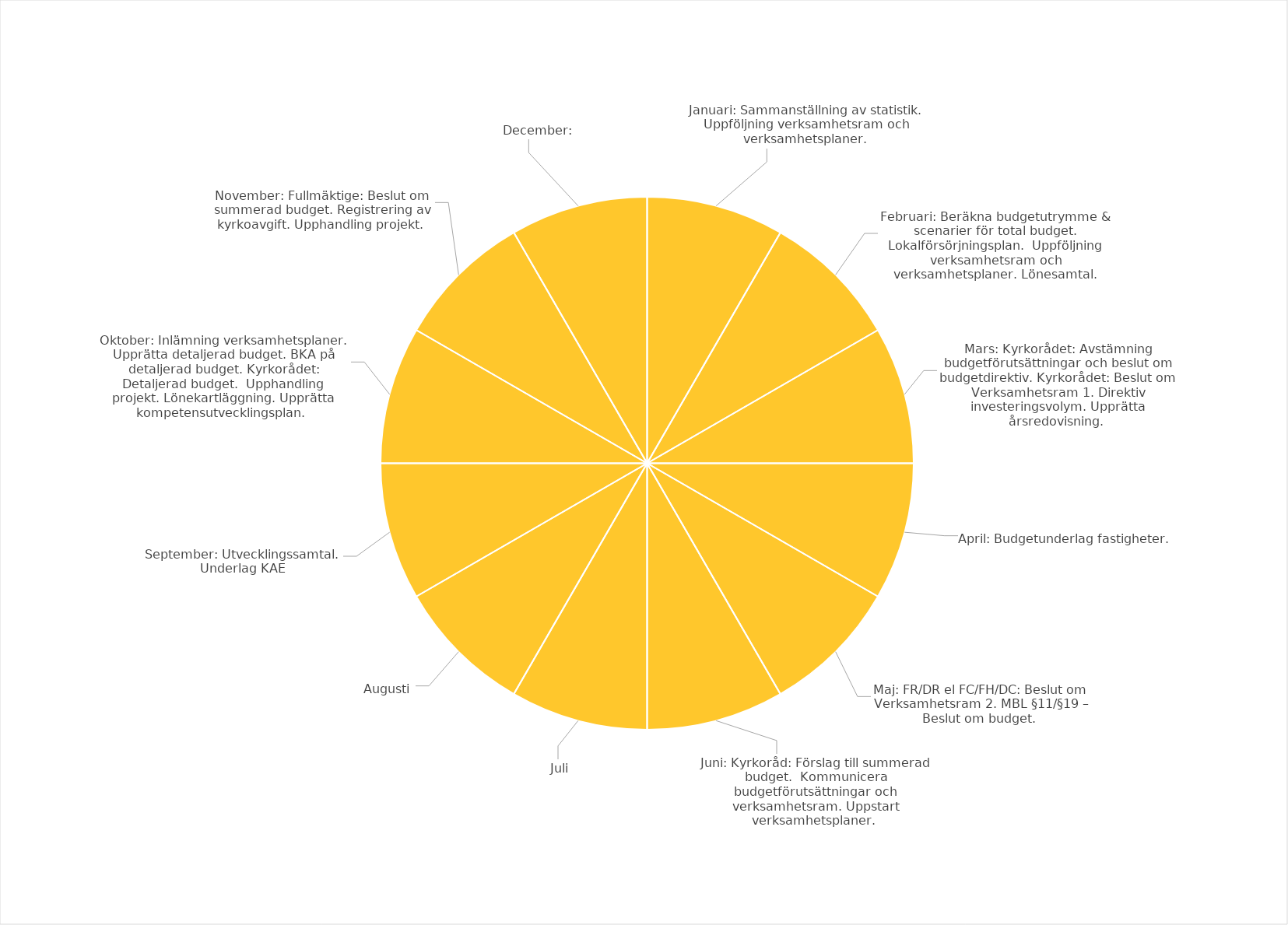
| Category | Series 0 |
|---|---|
| Januari: Sammanställning av statistik. Uppföljning verksamhetsram och verksamhetsplaner.  | 1 |
| Februari: Beräkna budgetutrymme & scenarier för total budget. Lokalförsörjningsplan.  Uppföljning verksamhetsram och verksamhetsplaner. Lönesamtal.


 | 1 |
| Mars: Kyrkorådet: Avstämning budgetförutsättningar och beslut om budgetdirektiv. Kyrkorådet: Beslut om Verksamhetsram 1. Direktiv investeringsvolym. Upprätta årsredovisning.  | 1 |
| April: Budgetunderlag fastigheter.  | 1 |
| Maj: FR/DR el FC/FH/DC: Beslut om Verksamhetsram 2. MBL §11/§19 – Beslut om budget.  | 1 |
| Juni: Kyrkoråd: Förslag till summerad budget.  Kommunicera budgetförutsättningar och verksamhetsram. Uppstart verksamhetsplaner.  | 1 |
| Juli | 1 |
| Augusti | 1 |
| September: Utvecklingssamtal. Underlag KAE | 1 |
| Oktober: Inlämning verksamhetsplaner. Upprätta detaljerad budget. BKA på detaljerad budget. Kyrkorådet: Detaljerad budget.  Upphandling projekt. Lönekartläggning. Upprätta kompetensutvecklingsplan.  | 1 |
| November: Fullmäktige: Beslut om summerad budget. Registrering av kyrkoavgift. Upphandling projekt.  | 1 |
| December:  | 1 |